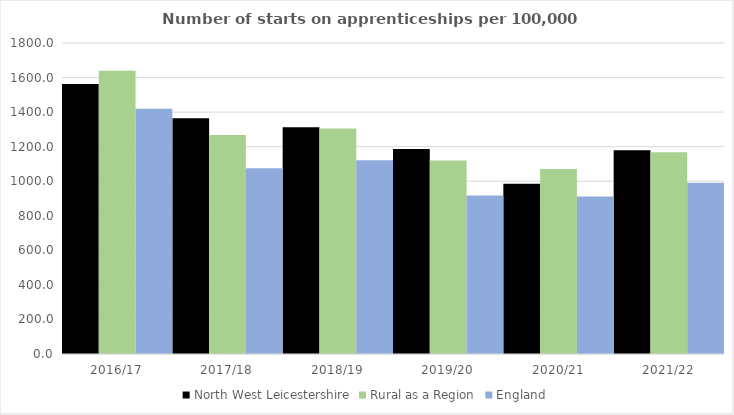
| Category | North West Leicestershire | Rural as a Region | England |
|---|---|---|---|
| 2016/17 | 1563 | 1638.789 | 1420 |
| 2017/18 | 1365 | 1267.474 | 1075 |
| 2018/19 | 1313 | 1304.57 | 1122 |
| 2019/20 | 1187 | 1119.662 | 918 |
| 2020/21 | 986 | 1070.748 | 912 |
| 2021/22 | 1179 | 1167.68 | 991 |